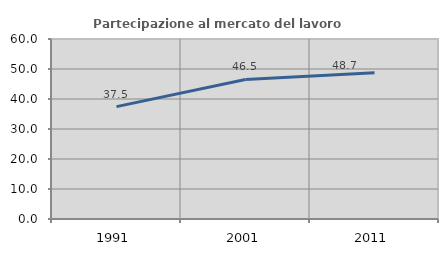
| Category | Partecipazione al mercato del lavoro  femminile |
|---|---|
| 1991.0 | 37.46 |
| 2001.0 | 46.508 |
| 2011.0 | 48.736 |